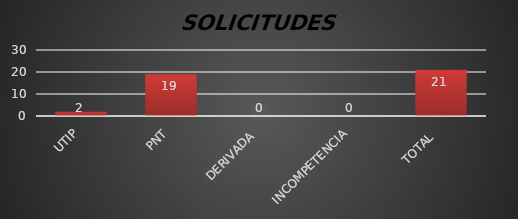
| Category | Series 1 |
|---|---|
| UTIP | 2 |
| PNT | 19 |
| DERIVADA  | 0 |
| INCOMPETENCIA | 0 |
| TOTAL  | 21 |